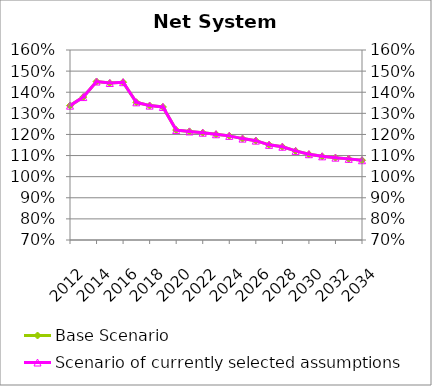
| Category | Base Scenario |
|---|---|
| 2012.0 | 1.336 |
| 2013.0 | 1.377 |
| 2014.0 | 1.451 |
| 2015.0 | 1.444 |
| 2016.0 | 1.448 |
| 2017.0 | 1.352 |
| 2018.0 | 1.337 |
| 2019.0 | 1.33 |
| 2020.0 | 1.221 |
| 2021.0 | 1.214 |
| 2022.0 | 1.208 |
| 2023.0 | 1.201 |
| 2024.0 | 1.193 |
| 2025.0 | 1.18 |
| 2026.0 | 1.171 |
| 2027.0 | 1.151 |
| 2028.0 | 1.142 |
| 2029.0 | 1.122 |
| 2030.0 | 1.106 |
| 2031.0 | 1.096 |
| 2032.0 | 1.09 |
| 2033.0 | 1.084 |
| 2034.0 | 1.078 |